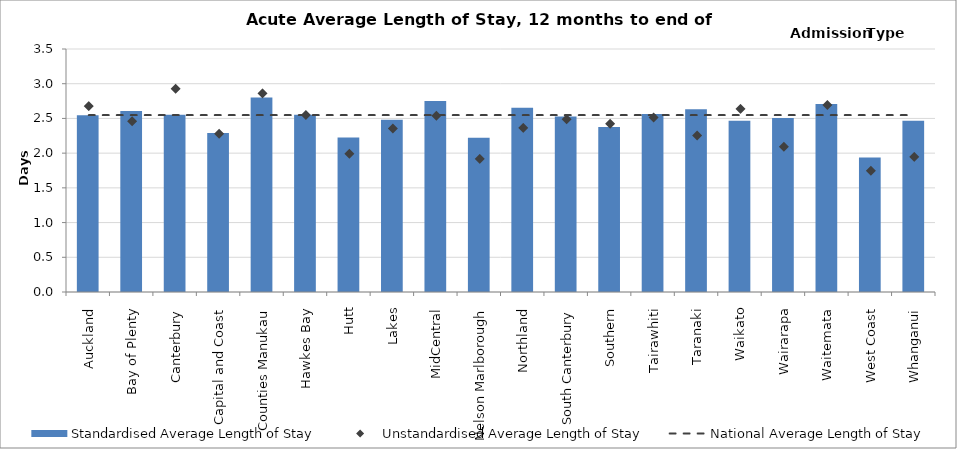
| Category | Standardised Average Length of Stay |
|---|---|
| Auckland | 2.546 |
| Bay of Plenty | 2.606 |
| Canterbury | 2.553 |
| Capital and Coast | 2.289 |
| Counties Manukau | 2.801 |
| Hawkes Bay | 2.554 |
| Hutt | 2.225 |
| Lakes | 2.482 |
| MidCentral | 2.749 |
| Nelson Marlborough | 2.222 |
| Northland | 2.655 |
| South Canterbury | 2.527 |
| Southern | 2.378 |
| Tairawhiti | 2.563 |
| Taranaki | 2.632 |
| Waikato | 2.466 |
| Wairarapa | 2.505 |
| Waitemata | 2.708 |
| West Coast | 1.937 |
| Whanganui | 2.467 |